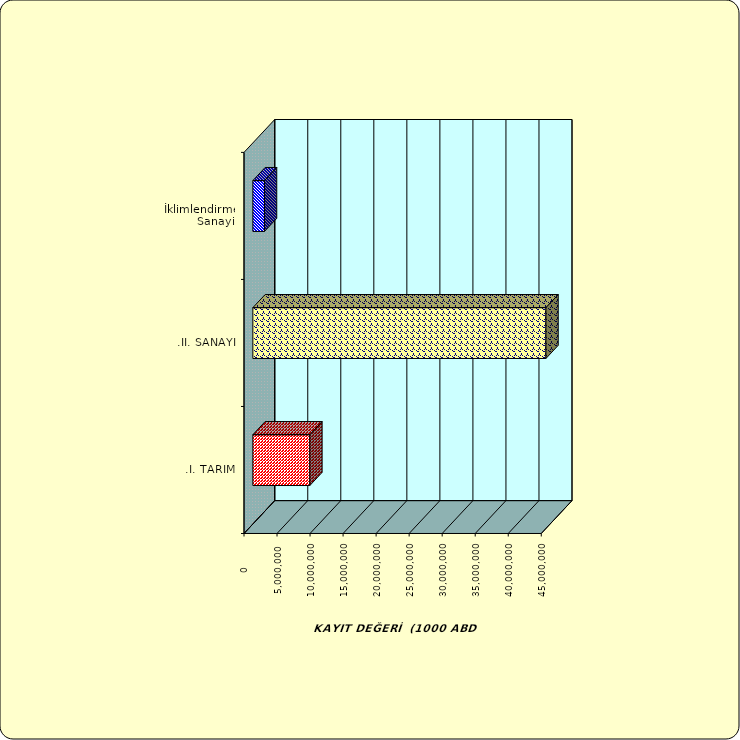
| Category | Series 0 |
|---|---|
| .I. TARIM | 8626126.647 |
| .II. SANAYİ | 44367739.535 |
|  İklimlendirme Sanayii | 1757132.501 |